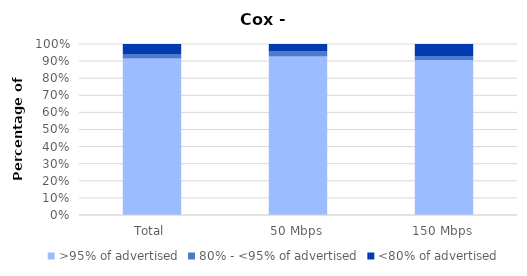
| Category | >95% of advertised | 80% - <95% of advertised | <80% of advertised |
|---|---|---|---|
| Total | 0.922 | 0.019 | 0.058 |
| 50 Mbps | 0.935 | 0.022 | 0.043 |
| 150 Mbps | 0.912 | 0.018 | 0.07 |